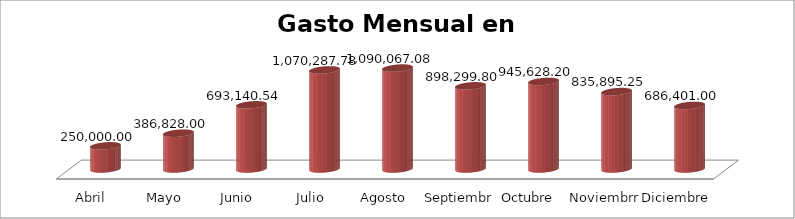
| Category | Suma  |
|---|---|
| Abril | 250000 |
| Mayo | 386828 |
| Junio | 693140.54 |
| Julio | 1070287.78 |
| Agosto | 1090067.08 |
| Septiembre | 898299.8 |
| Octubre  | 945628.2 |
| Noviembrre | 835895.25 |
| Diciembre | 686401 |